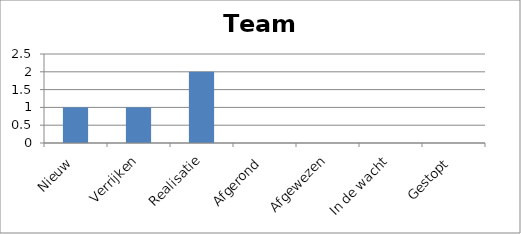
| Category | Team M |
|---|---|
| Nieuw | 1 |
| Verrijken | 1 |
| Realisatie | 2 |
| Afgerond | 0 |
| Afgewezen | 0 |
| In de wacht | 0 |
| Gestopt | 0 |